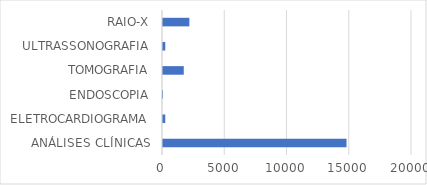
| Category | Series 0 |
|---|---|
| ANÁLISES CLÍNICAS | 14740 |
| ELETROCARDIOGRAMA | 182 |
| ENDOSCOPIA | 2 |
| TOMOGRAFIA | 1667 |
| ULTRASSONOGRAFIA | 181 |
| RAIO-X | 2117 |